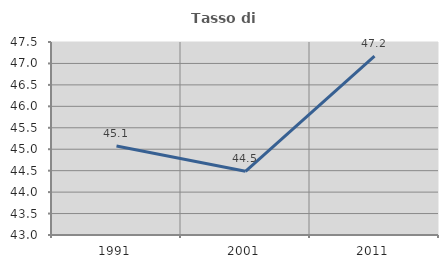
| Category | Tasso di occupazione   |
|---|---|
| 1991.0 | 45.075 |
| 2001.0 | 44.486 |
| 2011.0 | 47.17 |